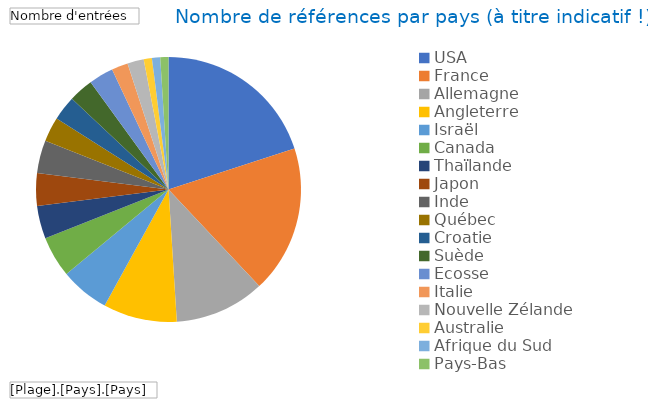
| Category | Total |
|---|---|
| USA | 20 |
| France | 18 |
| Allemagne | 11 |
| Angleterre | 9 |
| Israël | 6 |
| Canada | 5 |
| Thaïlande | 4 |
| Japon | 4 |
| Inde | 4 |
| Québec | 3 |
| Croatie | 3 |
| Suède | 3 |
| Ecosse | 3 |
| Italie | 2 |
| Nouvelle Zélande | 2 |
| Australie | 1 |
| Afrique du Sud | 1 |
| Pays-Bas | 1 |